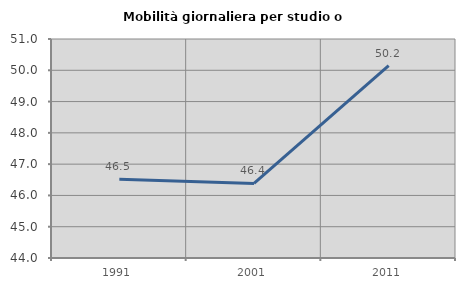
| Category | Mobilità giornaliera per studio o lavoro |
|---|---|
| 1991.0 | 46.517 |
| 2001.0 | 46.384 |
| 2011.0 | 50.15 |